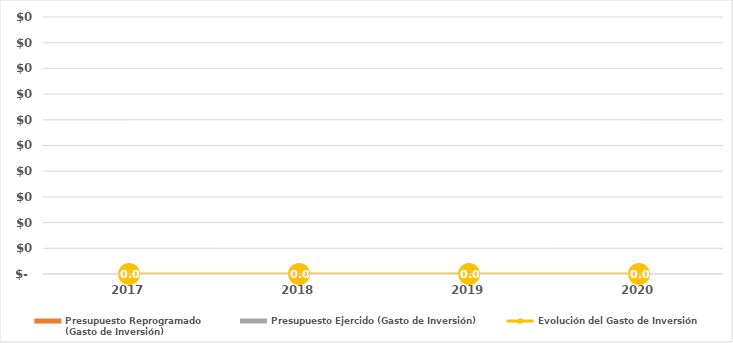
| Category | Presupuesto Reprogramado
(Gasto de Inversión) | Presupuesto Ejercido (Gasto de Inversión) |
|---|---|---|
| 2017.0 | 0 | 0 |
| 2018.0 | 0 | 0 |
| 2019.0 | 0 | 0 |
| 2020.0 | 0 | 0 |